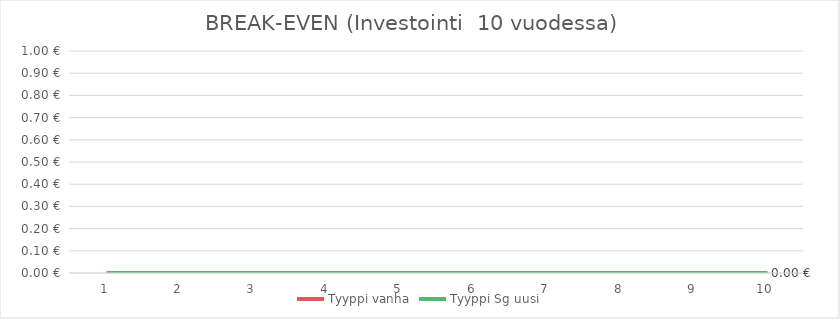
| Category | Tyyppi vanha | Tyyppi Sg uusi | 19W Rax (on/off) | Løsning 2 |
|---|---|---|---|---|
| 0 | 0 | 0 |  |  |
| 1 | 0 | 0 |  |  |
| 2 | 0 | 0 |  |  |
| 3 | 0 | 0 |  |  |
| 4 | 0 | 0 |  |  |
| 5 | 0 | 0 |  |  |
| 6 | 0 | 0 |  |  |
| 7 | 0 | 0 |  |  |
| 8 | 0 | 0 |  |  |
| 9 | 0 | 0 |  |  |